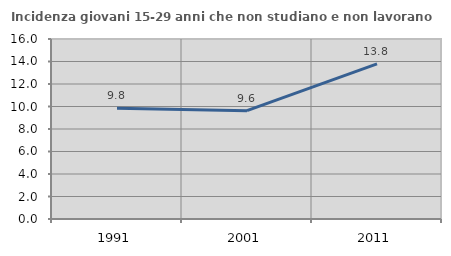
| Category | Incidenza giovani 15-29 anni che non studiano e non lavorano  |
|---|---|
| 1991.0 | 9.839 |
| 2001.0 | 9.632 |
| 2011.0 | 13.782 |